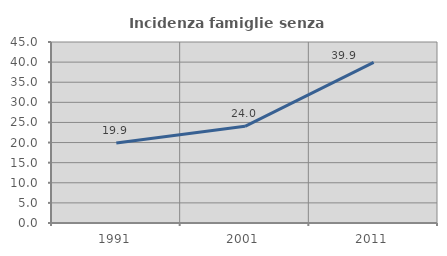
| Category | Incidenza famiglie senza nuclei |
|---|---|
| 1991.0 | 19.896 |
| 2001.0 | 24.032 |
| 2011.0 | 39.92 |